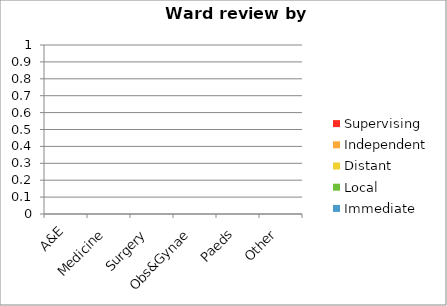
| Category | Immediate | Local | Distant | Independent | Supervising |
|---|---|---|---|---|---|
| A&E | 0 | 0 | 0 | 0 | 0 |
| Medicine | 0 | 0 | 0 | 0 | 0 |
| Surgery | 0 | 0 | 0 | 0 | 0 |
| Obs&Gynae | 0 | 0 | 0 | 0 | 0 |
| Paeds | 0 | 0 | 0 | 0 | 0 |
| Other | 0 | 0 | 0 | 0 | 0 |